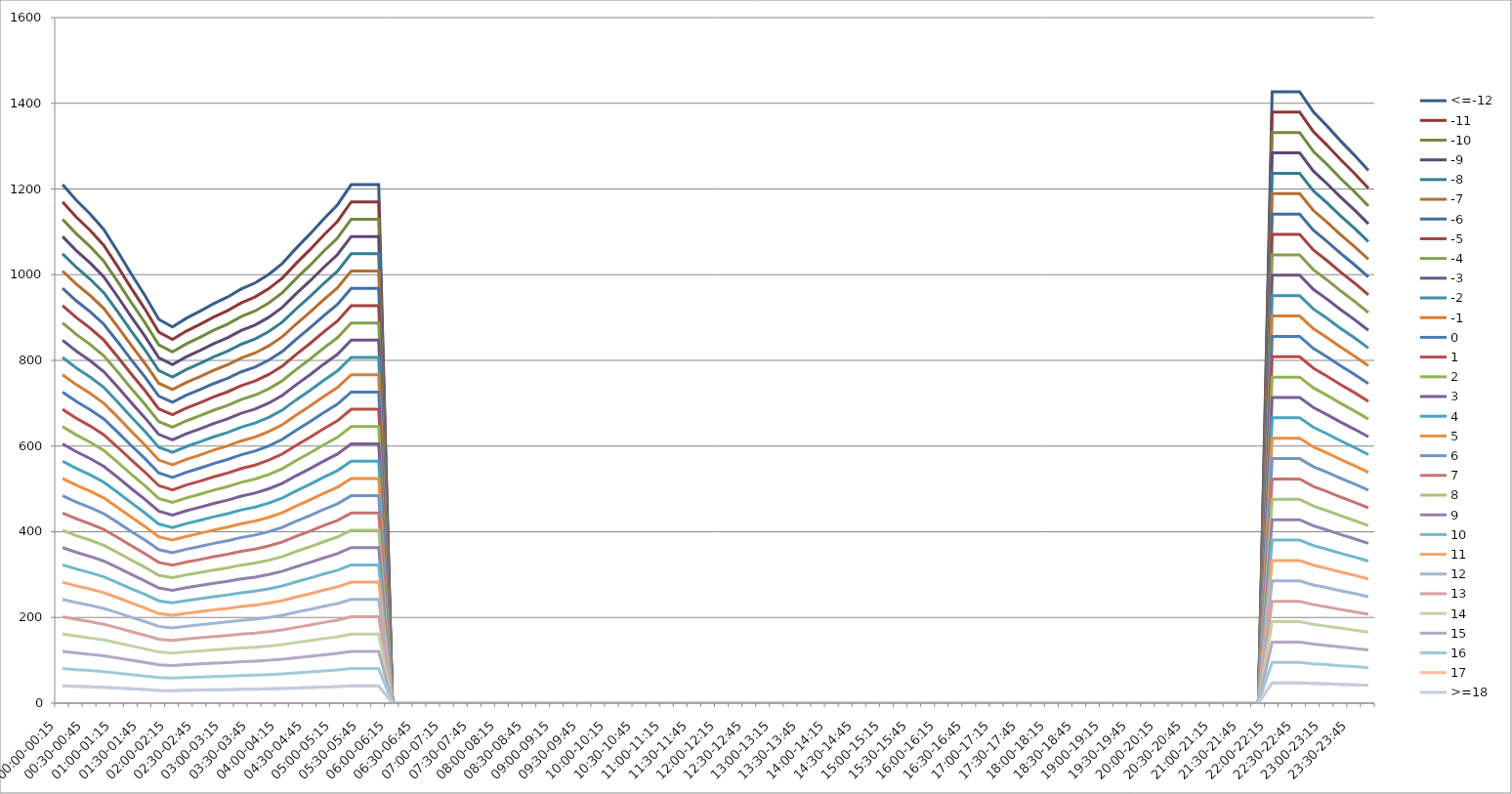
| Category | <=-12 | -11 | -10 | -9 | -8 | -7 | -6 | -5 | -4 | -3 | -2 | -1 | 0 | 1 | 2 | 3 | 4 | 5 | 6 | 7 | 8 | 9 | 10 | 11 | 12 | 13 | 14 | 15 | 16 | 17 | >=18 |
|---|---|---|---|---|---|---|---|---|---|---|---|---|---|---|---|---|---|---|---|---|---|---|---|---|---|---|---|---|---|---|---|
| 00:00-00:15 | 1210.163 | 1169.824 | 1129.486 | 1089.147 | 1048.808 | 1008.469 | 968.131 | 927.792 | 887.453 | 847.114 | 806.775 | 766.437 | 726.098 | 685.759 | 645.42 | 605.082 | 564.743 | 524.404 | 484.065 | 443.726 | 403.388 | 363.049 | 322.71 | 282.371 | 242.033 | 201.694 | 161.355 | 121.016 | 80.678 | 40.339 | 40.339 |
| 00:15-00:30 | 1173.67 | 1134.548 | 1095.425 | 1056.303 | 1017.181 | 978.058 | 938.936 | 899.814 | 860.691 | 821.569 | 782.447 | 743.324 | 704.202 | 665.08 | 625.957 | 586.835 | 547.713 | 508.59 | 469.468 | 430.346 | 391.223 | 352.101 | 312.979 | 273.856 | 234.734 | 195.612 | 156.489 | 117.367 | 78.245 | 39.122 | 39.122 |
| 00:30-00:45 | 1141.885 | 1103.823 | 1065.76 | 1027.697 | 989.634 | 951.571 | 913.508 | 875.446 | 837.383 | 799.32 | 761.257 | 723.194 | 685.131 | 647.068 | 609.006 | 570.943 | 532.88 | 494.817 | 456.754 | 418.691 | 380.628 | 342.566 | 304.503 | 266.44 | 228.377 | 190.314 | 152.251 | 114.189 | 76.126 | 38.063 | 38.063 |
| 00:45-01:00 | 1105.392 | 1068.546 | 1031.699 | 994.853 | 958.007 | 921.16 | 884.314 | 847.467 | 810.621 | 773.775 | 736.928 | 700.082 | 663.235 | 626.389 | 589.543 | 552.696 | 515.85 | 479.003 | 442.157 | 405.31 | 368.464 | 331.618 | 294.771 | 257.925 | 221.078 | 184.232 | 147.386 | 110.539 | 73.693 | 36.846 | 36.846 |
| 01:00-01:15 | 1054.773 | 1019.613 | 984.454 | 949.295 | 914.136 | 878.977 | 843.818 | 808.659 | 773.5 | 738.341 | 703.182 | 668.023 | 632.864 | 597.704 | 562.545 | 527.386 | 492.227 | 457.068 | 421.909 | 386.75 | 351.591 | 316.432 | 281.273 | 246.114 | 210.955 | 175.795 | 140.636 | 105.477 | 70.318 | 35.159 | 35.159 |
| 01:15-01:30 | 1001.799 | 968.405 | 935.012 | 901.619 | 868.225 | 834.832 | 801.439 | 768.046 | 734.652 | 701.259 | 667.866 | 634.472 | 601.079 | 567.686 | 534.293 | 500.899 | 467.506 | 434.113 | 400.719 | 367.326 | 333.933 | 300.54 | 267.146 | 233.753 | 200.36 | 166.966 | 133.573 | 100.18 | 66.787 | 33.393 | 33.393 |
| 01:30-01:45 | 951.179 | 919.473 | 887.767 | 856.061 | 824.355 | 792.649 | 760.943 | 729.237 | 697.531 | 665.825 | 634.119 | 602.413 | 570.707 | 539.001 | 507.295 | 475.589 | 443.883 | 412.177 | 380.472 | 348.766 | 317.06 | 285.354 | 253.648 | 221.942 | 190.236 | 158.53 | 126.824 | 95.118 | 63.412 | 31.706 | 31.706 |
| 01:45-02:00 | 895.85 | 865.989 | 836.127 | 806.265 | 776.404 | 746.542 | 716.68 | 686.819 | 656.957 | 627.095 | 597.234 | 567.372 | 537.51 | 507.649 | 477.787 | 447.925 | 418.064 | 388.202 | 358.34 | 328.478 | 298.617 | 268.755 | 238.893 | 209.032 | 179.17 | 149.308 | 119.447 | 89.585 | 59.723 | 29.862 | 29.862 |
| 02:00-02:15 | 878.192 | 848.919 | 819.646 | 790.373 | 761.1 | 731.827 | 702.554 | 673.281 | 644.008 | 614.735 | 585.462 | 556.188 | 526.915 | 497.642 | 468.369 | 439.096 | 409.823 | 380.55 | 351.277 | 322.004 | 292.731 | 263.458 | 234.185 | 204.912 | 175.638 | 146.365 | 117.092 | 87.819 | 58.546 | 29.273 | 29.273 |
| 02:15-02:30 | 898.205 | 868.265 | 838.324 | 808.384 | 778.444 | 748.504 | 718.564 | 688.624 | 658.683 | 628.743 | 598.803 | 568.863 | 538.923 | 508.983 | 479.043 | 449.102 | 419.162 | 389.222 | 359.282 | 329.342 | 299.402 | 269.461 | 239.521 | 209.581 | 179.641 | 149.701 | 119.761 | 89.82 | 59.88 | 29.94 | 29.94 |
| 02:30-02:45 | 914.686 | 884.196 | 853.707 | 823.217 | 792.728 | 762.238 | 731.748 | 701.259 | 670.769 | 640.28 | 609.79 | 579.301 | 548.811 | 518.322 | 487.832 | 457.343 | 426.853 | 396.364 | 365.874 | 335.385 | 304.895 | 274.406 | 243.916 | 213.427 | 182.937 | 152.448 | 121.958 | 91.469 | 60.979 | 30.49 | 30.49 |
| 02:45-03:00 | 932.344 | 901.265 | 870.187 | 839.109 | 808.031 | 776.953 | 745.875 | 714.797 | 683.719 | 652.641 | 621.562 | 590.484 | 559.406 | 528.328 | 497.25 | 466.172 | 435.094 | 404.016 | 372.937 | 341.859 | 310.781 | 279.703 | 248.625 | 217.547 | 186.469 | 155.391 | 124.312 | 93.234 | 62.156 | 31.078 | 31.078 |
| 03:00-03:15 | 947.647 | 916.059 | 884.471 | 852.883 | 821.294 | 789.706 | 758.118 | 726.53 | 694.941 | 663.353 | 631.765 | 600.177 | 568.588 | 537 | 505.412 | 473.824 | 442.235 | 410.647 | 379.059 | 347.471 | 315.882 | 284.294 | 252.706 | 221.118 | 189.529 | 157.941 | 126.353 | 94.765 | 63.176 | 31.588 | 31.588 |
| 03:15-03:30 | 966.482 | 934.266 | 902.05 | 869.834 | 837.618 | 805.402 | 773.186 | 740.97 | 708.754 | 676.538 | 644.322 | 612.106 | 579.889 | 547.673 | 515.457 | 483.241 | 451.025 | 418.809 | 386.593 | 354.377 | 322.161 | 289.945 | 257.729 | 225.513 | 193.296 | 161.08 | 128.864 | 96.648 | 64.432 | 32.216 | 32.216 |
| 03:30-03:45 | 980.609 | 947.922 | 915.235 | 882.548 | 849.861 | 817.174 | 784.487 | 751.8 | 719.113 | 686.426 | 653.739 | 621.052 | 588.365 | 555.678 | 522.991 | 490.304 | 457.617 | 424.931 | 392.244 | 359.557 | 326.87 | 294.183 | 261.496 | 228.809 | 196.122 | 163.435 | 130.748 | 98.061 | 65.374 | 32.687 | 32.687 |
| 03:45-04:00 | 1000.621 | 967.267 | 933.913 | 900.559 | 867.205 | 833.851 | 800.497 | 767.143 | 733.789 | 700.435 | 667.081 | 633.727 | 600.373 | 567.019 | 533.665 | 500.311 | 466.957 | 433.603 | 400.249 | 366.894 | 333.54 | 300.186 | 266.832 | 233.478 | 200.124 | 166.77 | 133.416 | 100.062 | 66.708 | 33.354 | 33.354 |
| 04:00-04:15 | 1026.52 | 992.302 | 958.085 | 923.868 | 889.65 | 855.433 | 821.216 | 786.998 | 752.781 | 718.564 | 684.346 | 650.129 | 615.912 | 581.695 | 547.477 | 513.26 | 479.043 | 444.825 | 410.608 | 376.391 | 342.173 | 307.956 | 273.739 | 239.521 | 205.304 | 171.087 | 136.869 | 102.652 | 68.435 | 34.217 | 34.217 |
| 04:15-04:30 | 1061.836 | 1026.441 | 991.047 | 955.652 | 920.258 | 884.863 | 849.469 | 814.074 | 778.68 | 743.285 | 707.891 | 672.496 | 637.101 | 601.707 | 566.312 | 530.918 | 495.523 | 460.129 | 424.734 | 389.34 | 353.945 | 318.551 | 283.156 | 247.762 | 212.367 | 176.973 | 141.578 | 106.184 | 70.789 | 35.395 | 35.395 |
| 04:30-04:45 | 1094.797 | 1058.304 | 1021.811 | 985.318 | 948.824 | 912.331 | 875.838 | 839.345 | 802.851 | 766.358 | 729.865 | 693.372 | 656.878 | 620.385 | 583.892 | 547.399 | 510.905 | 474.412 | 437.919 | 401.426 | 364.932 | 328.439 | 291.946 | 255.453 | 218.959 | 182.466 | 145.973 | 109.48 | 72.986 | 36.493 | 36.493 |
| 04:45-05:00 | 1130.113 | 1092.443 | 1054.773 | 1017.102 | 979.432 | 941.761 | 904.091 | 866.42 | 828.75 | 791.079 | 753.409 | 715.739 | 678.068 | 640.398 | 602.727 | 565.057 | 527.386 | 489.716 | 452.045 | 414.375 | 376.704 | 339.034 | 301.364 | 263.693 | 226.023 | 188.352 | 150.682 | 113.011 | 75.341 | 37.67 | 37.67 |
| 05:00-05:15 | 1163.075 | 1124.306 | 1085.537 | 1046.768 | 1007.998 | 969.229 | 930.46 | 891.691 | 852.922 | 814.153 | 775.383 | 736.614 | 697.845 | 659.076 | 620.307 | 581.538 | 542.768 | 503.999 | 465.23 | 426.461 | 387.692 | 348.923 | 310.153 | 271.384 | 232.615 | 193.846 | 155.077 | 116.308 | 77.538 | 38.769 | 38.769 |
| 05:15-05:30 | 1210.163 | 1169.824 | 1129.486 | 1089.147 | 1048.808 | 1008.469 | 968.131 | 927.792 | 887.453 | 847.114 | 806.775 | 766.437 | 726.098 | 685.759 | 645.42 | 605.082 | 564.743 | 524.404 | 484.065 | 443.726 | 403.388 | 363.049 | 322.71 | 282.371 | 242.033 | 201.694 | 161.355 | 121.016 | 80.678 | 40.339 | 40.339 |
| 05:30-05:45 | 1210.163 | 1169.824 | 1129.486 | 1089.147 | 1048.808 | 1008.469 | 968.131 | 927.792 | 887.453 | 847.114 | 806.775 | 766.437 | 726.098 | 685.759 | 645.42 | 605.082 | 564.743 | 524.404 | 484.065 | 443.726 | 403.388 | 363.049 | 322.71 | 282.371 | 242.033 | 201.694 | 161.355 | 121.016 | 80.678 | 40.339 | 40.339 |
| 05:45-06:00 | 1210.163 | 1169.824 | 1129.486 | 1089.147 | 1048.808 | 1008.469 | 968.131 | 927.792 | 887.453 | 847.114 | 806.775 | 766.437 | 726.098 | 685.759 | 645.42 | 605.082 | 564.743 | 524.404 | 484.065 | 443.726 | 403.388 | 363.049 | 322.71 | 282.371 | 242.033 | 201.694 | 161.355 | 121.016 | 80.678 | 40.339 | 40.339 |
| 06:00-06:15 | 0 | 0 | 0 | 0 | 0 | 0 | 0 | 0 | 0 | 0 | 0 | 0 | 0 | 0 | 0 | 0 | 0 | 0 | 0 | 0 | 0 | 0 | 0 | 0 | 0 | 0 | 0 | 0 | 0 | 0 | 0 |
| 06:15-06:30 | 0 | 0 | 0 | 0 | 0 | 0 | 0 | 0 | 0 | 0 | 0 | 0 | 0 | 0 | 0 | 0 | 0 | 0 | 0 | 0 | 0 | 0 | 0 | 0 | 0 | 0 | 0 | 0 | 0 | 0 | 0 |
| 06:30-06:45 | 0 | 0 | 0 | 0 | 0 | 0 | 0 | 0 | 0 | 0 | 0 | 0 | 0 | 0 | 0 | 0 | 0 | 0 | 0 | 0 | 0 | 0 | 0 | 0 | 0 | 0 | 0 | 0 | 0 | 0 | 0 |
| 06:45-07:00 | 0 | 0 | 0 | 0 | 0 | 0 | 0 | 0 | 0 | 0 | 0 | 0 | 0 | 0 | 0 | 0 | 0 | 0 | 0 | 0 | 0 | 0 | 0 | 0 | 0 | 0 | 0 | 0 | 0 | 0 | 0 |
| 07:00-07:15 | 0 | 0 | 0 | 0 | 0 | 0 | 0 | 0 | 0 | 0 | 0 | 0 | 0 | 0 | 0 | 0 | 0 | 0 | 0 | 0 | 0 | 0 | 0 | 0 | 0 | 0 | 0 | 0 | 0 | 0 | 0 |
| 07:15-07:30 | 0 | 0 | 0 | 0 | 0 | 0 | 0 | 0 | 0 | 0 | 0 | 0 | 0 | 0 | 0 | 0 | 0 | 0 | 0 | 0 | 0 | 0 | 0 | 0 | 0 | 0 | 0 | 0 | 0 | 0 | 0 |
| 07:30-07:45 | 0 | 0 | 0 | 0 | 0 | 0 | 0 | 0 | 0 | 0 | 0 | 0 | 0 | 0 | 0 | 0 | 0 | 0 | 0 | 0 | 0 | 0 | 0 | 0 | 0 | 0 | 0 | 0 | 0 | 0 | 0 |
| 07:45-08:00 | 0 | 0 | 0 | 0 | 0 | 0 | 0 | 0 | 0 | 0 | 0 | 0 | 0 | 0 | 0 | 0 | 0 | 0 | 0 | 0 | 0 | 0 | 0 | 0 | 0 | 0 | 0 | 0 | 0 | 0 | 0 |
| 08:00-08:15 | 0 | 0 | 0 | 0 | 0 | 0 | 0 | 0 | 0 | 0 | 0 | 0 | 0 | 0 | 0 | 0 | 0 | 0 | 0 | 0 | 0 | 0 | 0 | 0 | 0 | 0 | 0 | 0 | 0 | 0 | 0 |
| 08:15-08:30 | 0 | 0 | 0 | 0 | 0 | 0 | 0 | 0 | 0 | 0 | 0 | 0 | 0 | 0 | 0 | 0 | 0 | 0 | 0 | 0 | 0 | 0 | 0 | 0 | 0 | 0 | 0 | 0 | 0 | 0 | 0 |
| 08:30-08:45 | 0 | 0 | 0 | 0 | 0 | 0 | 0 | 0 | 0 | 0 | 0 | 0 | 0 | 0 | 0 | 0 | 0 | 0 | 0 | 0 | 0 | 0 | 0 | 0 | 0 | 0 | 0 | 0 | 0 | 0 | 0 |
| 08:45-09:00 | 0 | 0 | 0 | 0 | 0 | 0 | 0 | 0 | 0 | 0 | 0 | 0 | 0 | 0 | 0 | 0 | 0 | 0 | 0 | 0 | 0 | 0 | 0 | 0 | 0 | 0 | 0 | 0 | 0 | 0 | 0 |
| 09:00-09:15 | 0 | 0 | 0 | 0 | 0 | 0 | 0 | 0 | 0 | 0 | 0 | 0 | 0 | 0 | 0 | 0 | 0 | 0 | 0 | 0 | 0 | 0 | 0 | 0 | 0 | 0 | 0 | 0 | 0 | 0 | 0 |
| 09:15-09:30 | 0 | 0 | 0 | 0 | 0 | 0 | 0 | 0 | 0 | 0 | 0 | 0 | 0 | 0 | 0 | 0 | 0 | 0 | 0 | 0 | 0 | 0 | 0 | 0 | 0 | 0 | 0 | 0 | 0 | 0 | 0 |
| 09:30-09:45 | 0 | 0 | 0 | 0 | 0 | 0 | 0 | 0 | 0 | 0 | 0 | 0 | 0 | 0 | 0 | 0 | 0 | 0 | 0 | 0 | 0 | 0 | 0 | 0 | 0 | 0 | 0 | 0 | 0 | 0 | 0 |
| 09:45-10:00 | 0 | 0 | 0 | 0 | 0 | 0 | 0 | 0 | 0 | 0 | 0 | 0 | 0 | 0 | 0 | 0 | 0 | 0 | 0 | 0 | 0 | 0 | 0 | 0 | 0 | 0 | 0 | 0 | 0 | 0 | 0 |
| 10:00-10:15 | 0 | 0 | 0 | 0 | 0 | 0 | 0 | 0 | 0 | 0 | 0 | 0 | 0 | 0 | 0 | 0 | 0 | 0 | 0 | 0 | 0 | 0 | 0 | 0 | 0 | 0 | 0 | 0 | 0 | 0 | 0 |
| 10:15-10:30 | 0 | 0 | 0 | 0 | 0 | 0 | 0 | 0 | 0 | 0 | 0 | 0 | 0 | 0 | 0 | 0 | 0 | 0 | 0 | 0 | 0 | 0 | 0 | 0 | 0 | 0 | 0 | 0 | 0 | 0 | 0 |
| 10:30-10:45 | 0 | 0 | 0 | 0 | 0 | 0 | 0 | 0 | 0 | 0 | 0 | 0 | 0 | 0 | 0 | 0 | 0 | 0 | 0 | 0 | 0 | 0 | 0 | 0 | 0 | 0 | 0 | 0 | 0 | 0 | 0 |
| 10:45-11:00 | 0 | 0 | 0 | 0 | 0 | 0 | 0 | 0 | 0 | 0 | 0 | 0 | 0 | 0 | 0 | 0 | 0 | 0 | 0 | 0 | 0 | 0 | 0 | 0 | 0 | 0 | 0 | 0 | 0 | 0 | 0 |
| 11:00-11:15 | 0 | 0 | 0 | 0 | 0 | 0 | 0 | 0 | 0 | 0 | 0 | 0 | 0 | 0 | 0 | 0 | 0 | 0 | 0 | 0 | 0 | 0 | 0 | 0 | 0 | 0 | 0 | 0 | 0 | 0 | 0 |
| 11:15-11:30 | 0 | 0 | 0 | 0 | 0 | 0 | 0 | 0 | 0 | 0 | 0 | 0 | 0 | 0 | 0 | 0 | 0 | 0 | 0 | 0 | 0 | 0 | 0 | 0 | 0 | 0 | 0 | 0 | 0 | 0 | 0 |
| 11:30-11:45 | 0 | 0 | 0 | 0 | 0 | 0 | 0 | 0 | 0 | 0 | 0 | 0 | 0 | 0 | 0 | 0 | 0 | 0 | 0 | 0 | 0 | 0 | 0 | 0 | 0 | 0 | 0 | 0 | 0 | 0 | 0 |
| 11:45-12:00 | 0 | 0 | 0 | 0 | 0 | 0 | 0 | 0 | 0 | 0 | 0 | 0 | 0 | 0 | 0 | 0 | 0 | 0 | 0 | 0 | 0 | 0 | 0 | 0 | 0 | 0 | 0 | 0 | 0 | 0 | 0 |
| 12:00-12:15 | 0 | 0 | 0 | 0 | 0 | 0 | 0 | 0 | 0 | 0 | 0 | 0 | 0 | 0 | 0 | 0 | 0 | 0 | 0 | 0 | 0 | 0 | 0 | 0 | 0 | 0 | 0 | 0 | 0 | 0 | 0 |
| 12:15-12:30 | 0 | 0 | 0 | 0 | 0 | 0 | 0 | 0 | 0 | 0 | 0 | 0 | 0 | 0 | 0 | 0 | 0 | 0 | 0 | 0 | 0 | 0 | 0 | 0 | 0 | 0 | 0 | 0 | 0 | 0 | 0 |
| 12:30-12:45 | 0 | 0 | 0 | 0 | 0 | 0 | 0 | 0 | 0 | 0 | 0 | 0 | 0 | 0 | 0 | 0 | 0 | 0 | 0 | 0 | 0 | 0 | 0 | 0 | 0 | 0 | 0 | 0 | 0 | 0 | 0 |
| 12:45-13:00 | 0 | 0 | 0 | 0 | 0 | 0 | 0 | 0 | 0 | 0 | 0 | 0 | 0 | 0 | 0 | 0 | 0 | 0 | 0 | 0 | 0 | 0 | 0 | 0 | 0 | 0 | 0 | 0 | 0 | 0 | 0 |
| 13:00-13:15 | 0 | 0 | 0 | 0 | 0 | 0 | 0 | 0 | 0 | 0 | 0 | 0 | 0 | 0 | 0 | 0 | 0 | 0 | 0 | 0 | 0 | 0 | 0 | 0 | 0 | 0 | 0 | 0 | 0 | 0 | 0 |
| 13:15-13:30 | 0 | 0 | 0 | 0 | 0 | 0 | 0 | 0 | 0 | 0 | 0 | 0 | 0 | 0 | 0 | 0 | 0 | 0 | 0 | 0 | 0 | 0 | 0 | 0 | 0 | 0 | 0 | 0 | 0 | 0 | 0 |
| 13:30-13:45 | 0 | 0 | 0 | 0 | 0 | 0 | 0 | 0 | 0 | 0 | 0 | 0 | 0 | 0 | 0 | 0 | 0 | 0 | 0 | 0 | 0 | 0 | 0 | 0 | 0 | 0 | 0 | 0 | 0 | 0 | 0 |
| 13:45-14:00 | 0 | 0 | 0 | 0 | 0 | 0 | 0 | 0 | 0 | 0 | 0 | 0 | 0 | 0 | 0 | 0 | 0 | 0 | 0 | 0 | 0 | 0 | 0 | 0 | 0 | 0 | 0 | 0 | 0 | 0 | 0 |
| 14:00-14:15 | 0 | 0 | 0 | 0 | 0 | 0 | 0 | 0 | 0 | 0 | 0 | 0 | 0 | 0 | 0 | 0 | 0 | 0 | 0 | 0 | 0 | 0 | 0 | 0 | 0 | 0 | 0 | 0 | 0 | 0 | 0 |
| 14:15-14:30 | 0 | 0 | 0 | 0 | 0 | 0 | 0 | 0 | 0 | 0 | 0 | 0 | 0 | 0 | 0 | 0 | 0 | 0 | 0 | 0 | 0 | 0 | 0 | 0 | 0 | 0 | 0 | 0 | 0 | 0 | 0 |
| 14:30-14:45 | 0 | 0 | 0 | 0 | 0 | 0 | 0 | 0 | 0 | 0 | 0 | 0 | 0 | 0 | 0 | 0 | 0 | 0 | 0 | 0 | 0 | 0 | 0 | 0 | 0 | 0 | 0 | 0 | 0 | 0 | 0 |
| 14:45-15:00 | 0 | 0 | 0 | 0 | 0 | 0 | 0 | 0 | 0 | 0 | 0 | 0 | 0 | 0 | 0 | 0 | 0 | 0 | 0 | 0 | 0 | 0 | 0 | 0 | 0 | 0 | 0 | 0 | 0 | 0 | 0 |
| 15:00-15:15 | 0 | 0 | 0 | 0 | 0 | 0 | 0 | 0 | 0 | 0 | 0 | 0 | 0 | 0 | 0 | 0 | 0 | 0 | 0 | 0 | 0 | 0 | 0 | 0 | 0 | 0 | 0 | 0 | 0 | 0 | 0 |
| 15:15-15:30 | 0 | 0 | 0 | 0 | 0 | 0 | 0 | 0 | 0 | 0 | 0 | 0 | 0 | 0 | 0 | 0 | 0 | 0 | 0 | 0 | 0 | 0 | 0 | 0 | 0 | 0 | 0 | 0 | 0 | 0 | 0 |
| 15:30-15:45 | 0 | 0 | 0 | 0 | 0 | 0 | 0 | 0 | 0 | 0 | 0 | 0 | 0 | 0 | 0 | 0 | 0 | 0 | 0 | 0 | 0 | 0 | 0 | 0 | 0 | 0 | 0 | 0 | 0 | 0 | 0 |
| 15:45-16:00 | 0 | 0 | 0 | 0 | 0 | 0 | 0 | 0 | 0 | 0 | 0 | 0 | 0 | 0 | 0 | 0 | 0 | 0 | 0 | 0 | 0 | 0 | 0 | 0 | 0 | 0 | 0 | 0 | 0 | 0 | 0 |
| 16:00-16:15 | 0 | 0 | 0 | 0 | 0 | 0 | 0 | 0 | 0 | 0 | 0 | 0 | 0 | 0 | 0 | 0 | 0 | 0 | 0 | 0 | 0 | 0 | 0 | 0 | 0 | 0 | 0 | 0 | 0 | 0 | 0 |
| 16:15-16:30 | 0 | 0 | 0 | 0 | 0 | 0 | 0 | 0 | 0 | 0 | 0 | 0 | 0 | 0 | 0 | 0 | 0 | 0 | 0 | 0 | 0 | 0 | 0 | 0 | 0 | 0 | 0 | 0 | 0 | 0 | 0 |
| 16:30-16:45 | 0 | 0 | 0 | 0 | 0 | 0 | 0 | 0 | 0 | 0 | 0 | 0 | 0 | 0 | 0 | 0 | 0 | 0 | 0 | 0 | 0 | 0 | 0 | 0 | 0 | 0 | 0 | 0 | 0 | 0 | 0 |
| 16:45-17:00 | 0 | 0 | 0 | 0 | 0 | 0 | 0 | 0 | 0 | 0 | 0 | 0 | 0 | 0 | 0 | 0 | 0 | 0 | 0 | 0 | 0 | 0 | 0 | 0 | 0 | 0 | 0 | 0 | 0 | 0 | 0 |
| 17:00-17:15 | 0 | 0 | 0 | 0 | 0 | 0 | 0 | 0 | 0 | 0 | 0 | 0 | 0 | 0 | 0 | 0 | 0 | 0 | 0 | 0 | 0 | 0 | 0 | 0 | 0 | 0 | 0 | 0 | 0 | 0 | 0 |
| 17:15-17:30 | 0 | 0 | 0 | 0 | 0 | 0 | 0 | 0 | 0 | 0 | 0 | 0 | 0 | 0 | 0 | 0 | 0 | 0 | 0 | 0 | 0 | 0 | 0 | 0 | 0 | 0 | 0 | 0 | 0 | 0 | 0 |
| 17:30-17:45 | 0 | 0 | 0 | 0 | 0 | 0 | 0 | 0 | 0 | 0 | 0 | 0 | 0 | 0 | 0 | 0 | 0 | 0 | 0 | 0 | 0 | 0 | 0 | 0 | 0 | 0 | 0 | 0 | 0 | 0 | 0 |
| 17:45-18:00 | 0 | 0 | 0 | 0 | 0 | 0 | 0 | 0 | 0 | 0 | 0 | 0 | 0 | 0 | 0 | 0 | 0 | 0 | 0 | 0 | 0 | 0 | 0 | 0 | 0 | 0 | 0 | 0 | 0 | 0 | 0 |
| 18:00-18:15 | 0 | 0 | 0 | 0 | 0 | 0 | 0 | 0 | 0 | 0 | 0 | 0 | 0 | 0 | 0 | 0 | 0 | 0 | 0 | 0 | 0 | 0 | 0 | 0 | 0 | 0 | 0 | 0 | 0 | 0 | 0 |
| 18:15-18:30 | 0 | 0 | 0 | 0 | 0 | 0 | 0 | 0 | 0 | 0 | 0 | 0 | 0 | 0 | 0 | 0 | 0 | 0 | 0 | 0 | 0 | 0 | 0 | 0 | 0 | 0 | 0 | 0 | 0 | 0 | 0 |
| 18:30-18:45 | 0 | 0 | 0 | 0 | 0 | 0 | 0 | 0 | 0 | 0 | 0 | 0 | 0 | 0 | 0 | 0 | 0 | 0 | 0 | 0 | 0 | 0 | 0 | 0 | 0 | 0 | 0 | 0 | 0 | 0 | 0 |
| 18:45-19:00 | 0 | 0 | 0 | 0 | 0 | 0 | 0 | 0 | 0 | 0 | 0 | 0 | 0 | 0 | 0 | 0 | 0 | 0 | 0 | 0 | 0 | 0 | 0 | 0 | 0 | 0 | 0 | 0 | 0 | 0 | 0 |
| 19:00-19:15 | 0 | 0 | 0 | 0 | 0 | 0 | 0 | 0 | 0 | 0 | 0 | 0 | 0 | 0 | 0 | 0 | 0 | 0 | 0 | 0 | 0 | 0 | 0 | 0 | 0 | 0 | 0 | 0 | 0 | 0 | 0 |
| 19:15-19:30 | 0 | 0 | 0 | 0 | 0 | 0 | 0 | 0 | 0 | 0 | 0 | 0 | 0 | 0 | 0 | 0 | 0 | 0 | 0 | 0 | 0 | 0 | 0 | 0 | 0 | 0 | 0 | 0 | 0 | 0 | 0 |
| 19:30-19:45 | 0 | 0 | 0 | 0 | 0 | 0 | 0 | 0 | 0 | 0 | 0 | 0 | 0 | 0 | 0 | 0 | 0 | 0 | 0 | 0 | 0 | 0 | 0 | 0 | 0 | 0 | 0 | 0 | 0 | 0 | 0 |
| 19:45-20:00 | 0 | 0 | 0 | 0 | 0 | 0 | 0 | 0 | 0 | 0 | 0 | 0 | 0 | 0 | 0 | 0 | 0 | 0 | 0 | 0 | 0 | 0 | 0 | 0 | 0 | 0 | 0 | 0 | 0 | 0 | 0 |
| 20:00-20:15 | 0 | 0 | 0 | 0 | 0 | 0 | 0 | 0 | 0 | 0 | 0 | 0 | 0 | 0 | 0 | 0 | 0 | 0 | 0 | 0 | 0 | 0 | 0 | 0 | 0 | 0 | 0 | 0 | 0 | 0 | 0 |
| 20:15-20:30 | 0 | 0 | 0 | 0 | 0 | 0 | 0 | 0 | 0 | 0 | 0 | 0 | 0 | 0 | 0 | 0 | 0 | 0 | 0 | 0 | 0 | 0 | 0 | 0 | 0 | 0 | 0 | 0 | 0 | 0 | 0 |
| 20:30-20:45 | 0 | 0 | 0 | 0 | 0 | 0 | 0 | 0 | 0 | 0 | 0 | 0 | 0 | 0 | 0 | 0 | 0 | 0 | 0 | 0 | 0 | 0 | 0 | 0 | 0 | 0 | 0 | 0 | 0 | 0 | 0 |
| 20:45-21:00 | 0 | 0 | 0 | 0 | 0 | 0 | 0 | 0 | 0 | 0 | 0 | 0 | 0 | 0 | 0 | 0 | 0 | 0 | 0 | 0 | 0 | 0 | 0 | 0 | 0 | 0 | 0 | 0 | 0 | 0 | 0 |
| 21:00-21:15 | 0 | 0 | 0 | 0 | 0 | 0 | 0 | 0 | 0 | 0 | 0 | 0 | 0 | 0 | 0 | 0 | 0 | 0 | 0 | 0 | 0 | 0 | 0 | 0 | 0 | 0 | 0 | 0 | 0 | 0 | 0 |
| 21:15-21:30 | 0 | 0 | 0 | 0 | 0 | 0 | 0 | 0 | 0 | 0 | 0 | 0 | 0 | 0 | 0 | 0 | 0 | 0 | 0 | 0 | 0 | 0 | 0 | 0 | 0 | 0 | 0 | 0 | 0 | 0 | 0 |
| 21:30-21:45 | 0 | 0 | 0 | 0 | 0 | 0 | 0 | 0 | 0 | 0 | 0 | 0 | 0 | 0 | 0 | 0 | 0 | 0 | 0 | 0 | 0 | 0 | 0 | 0 | 0 | 0 | 0 | 0 | 0 | 0 | 0 |
| 21:45-22:00 | 0 | 0 | 0 | 0 | 0 | 0 | 0 | 0 | 0 | 0 | 0 | 0 | 0 | 0 | 0 | 0 | 0 | 0 | 0 | 0 | 0 | 0 | 0 | 0 | 0 | 0 | 0 | 0 | 0 | 0 | 0 |
| 22:00-22:15 | 1426.768 | 1379.209 | 1331.65 | 1284.091 | 1236.532 | 1188.974 | 1141.415 | 1093.856 | 1046.297 | 998.738 | 951.179 | 903.62 | 856.061 | 808.502 | 760.943 | 713.384 | 665.825 | 618.266 | 570.707 | 523.148 | 475.589 | 428.03 | 380.472 | 332.913 | 285.354 | 237.795 | 190.236 | 142.677 | 95.118 | 47.559 | 47.559 |
| 22:15-22:30 | 1426.768 | 1379.209 | 1331.65 | 1284.091 | 1236.532 | 1188.974 | 1141.415 | 1093.856 | 1046.297 | 998.738 | 951.179 | 903.62 | 856.061 | 808.502 | 760.943 | 713.384 | 665.825 | 618.266 | 570.707 | 523.148 | 475.589 | 428.03 | 380.472 | 332.913 | 285.354 | 237.795 | 190.236 | 142.677 | 95.118 | 47.559 | 47.559 |
| 22:30-22:45 | 1426.768 | 1379.209 | 1331.65 | 1284.091 | 1236.532 | 1188.974 | 1141.415 | 1093.856 | 1046.297 | 998.738 | 951.179 | 903.62 | 856.061 | 808.502 | 760.943 | 713.384 | 665.825 | 618.266 | 570.707 | 523.148 | 475.589 | 428.03 | 380.472 | 332.913 | 285.354 | 237.795 | 190.236 | 142.677 | 95.118 | 47.559 | 47.559 |
| 22:45-23:00 | 1379.68 | 1333.691 | 1287.702 | 1241.712 | 1195.723 | 1149.733 | 1103.744 | 1057.755 | 1011.765 | 965.776 | 919.787 | 873.797 | 827.808 | 781.819 | 735.829 | 689.84 | 643.851 | 597.861 | 551.872 | 505.883 | 459.893 | 413.904 | 367.915 | 321.925 | 275.936 | 229.947 | 183.957 | 137.968 | 91.979 | 45.989 | 45.989 |
| 23:00-23:15 | 1346.719 | 1301.828 | 1256.937 | 1212.047 | 1167.156 | 1122.265 | 1077.375 | 1032.484 | 987.594 | 942.703 | 897.812 | 852.922 | 808.031 | 763.141 | 718.25 | 673.359 | 628.469 | 583.578 | 538.687 | 493.797 | 448.906 | 404.016 | 359.125 | 314.234 | 269.344 | 224.453 | 179.562 | 134.672 | 89.781 | 44.891 | 44.891 |
| 23:15-23:30 | 1311.403 | 1267.689 | 1223.976 | 1180.262 | 1136.549 | 1092.835 | 1049.122 | 1005.409 | 961.695 | 917.982 | 874.268 | 830.555 | 786.842 | 743.128 | 699.415 | 655.701 | 611.988 | 568.274 | 524.561 | 480.848 | 437.134 | 393.421 | 349.707 | 305.994 | 262.281 | 218.567 | 174.854 | 131.14 | 87.427 | 43.713 | 43.713 |
| 23:30-23:45 | 1278.441 | 1235.826 | 1193.211 | 1150.597 | 1107.982 | 1065.367 | 1022.753 | 980.138 | 937.523 | 894.909 | 852.294 | 809.679 | 767.065 | 724.45 | 681.835 | 639.22 | 596.606 | 553.991 | 511.376 | 468.762 | 426.147 | 383.532 | 340.918 | 298.303 | 255.688 | 213.073 | 170.459 | 127.844 | 85.229 | 42.615 | 42.615 |
| 23:45-00:00 | 1243.125 | 1201.687 | 1160.25 | 1118.812 | 1077.375 | 1035.937 | 994.5 | 953.062 | 911.625 | 870.187 | 828.75 | 787.312 | 745.875 | 704.437 | 663 | 621.562 | 580.125 | 538.687 | 497.25 | 455.812 | 414.375 | 372.937 | 331.5 | 290.062 | 248.625 | 207.187 | 165.75 | 124.312 | 82.875 | 41.437 | 41.437 |